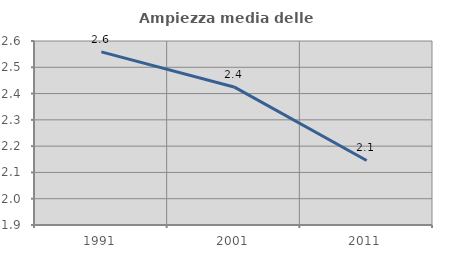
| Category | Ampiezza media delle famiglie |
|---|---|
| 1991.0 | 2.559 |
| 2001.0 | 2.425 |
| 2011.0 | 2.146 |